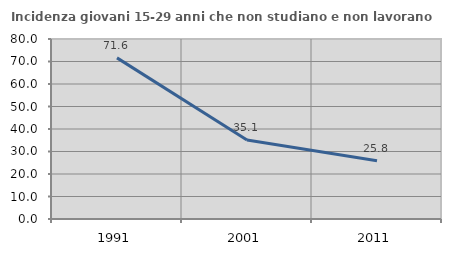
| Category | Incidenza giovani 15-29 anni che non studiano e non lavorano  |
|---|---|
| 1991.0 | 71.604 |
| 2001.0 | 35.088 |
| 2011.0 | 25.847 |